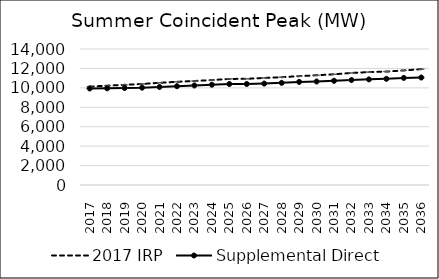
| Category | 2017 IRP | Supplemental Direct |
|---|---|---|
| 2017.0 | 10129.885 | 9934.753 |
| 2018.0 | 10224.713 | 9952.097 |
| 2019.0 | 10310.015 | 9985.643 |
| 2020.0 | 10403.218 | 10018.034 |
| 2021.0 | 10518.418 | 10090.171 |
| 2022.0 | 10624.16 | 10170.928 |
| 2023.0 | 10706.388 | 10246.21 |
| 2024.0 | 10804.439 | 10322.473 |
| 2025.0 | 10919.631 | 10397.748 |
| 2026.0 | 10931.281 | 10399.686 |
| 2027.0 | 11020.808 | 10440.588 |
| 2028.0 | 11096.123 | 10514.296 |
| 2029.0 | 11207.37 | 10612.889 |
| 2030.0 | 11295.158 | 10655.219 |
| 2031.0 | 11397.05 | 10723.956 |
| 2032.0 | 11535.765 | 10807.879 |
| 2033.0 | 11621.797 | 10874.151 |
| 2034.0 | 11676.522 | 10932.047 |
| 2035.0 | 11793.029 | 11023.221 |
| 2036.0 | 11924.57 | 11064.015 |